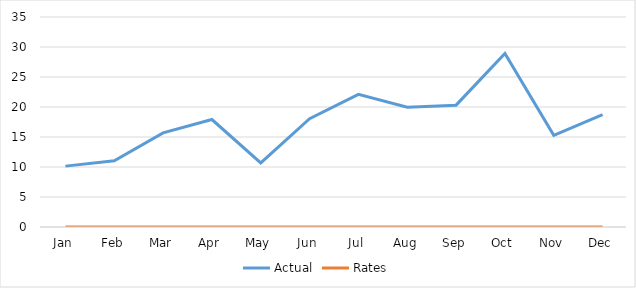
| Category | Actual | Rates |
|---|---|---|
| Jan | 10.146 | 0 |
| Feb | 11.043 | 0 |
| Mar | 15.687 | 0 |
| Apr | 17.911 | 0 |
| May | 10.687 | 0 |
| Jun | 18.044 | 0 |
| Jul | 22.104 | 0 |
| Aug | 19.974 | 0 |
| Sep | 20.308 | 0 |
| Oct | 28.914 | 0 |
| Nov | 15.274 | 0 |
| Dec | 18.719 | 0 |